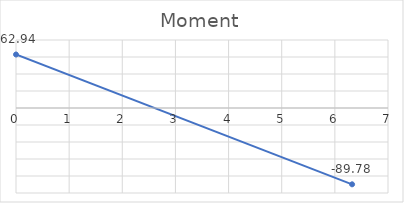
| Category | Series 0 |
|---|---|
| 0.0 | 62.944 |
| 6.324555320336759 | -89.777 |